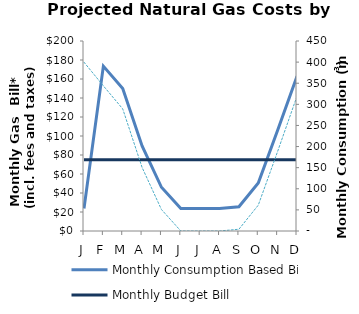
| Category | Monthly Consumption Based Bill | Monthly Budget Bill |
|---|---|---|
| J | 23.73 | 74.93 |
| F | 173.546 | 74.93 |
| M | 149.945 | 74.93 |
| A | 89.55 | 74.93 |
| M | 46.023 | 74.93 |
| J | 23.73 | 74.93 |
| J | 23.73 | 74.93 |
| A | 23.73 | 74.93 |
| S | 25.56 | 74.93 |
| O | 50.549 | 74.93 |
| N | 106.069 | 74.93 |
| D | 162.998 | 74.93 |